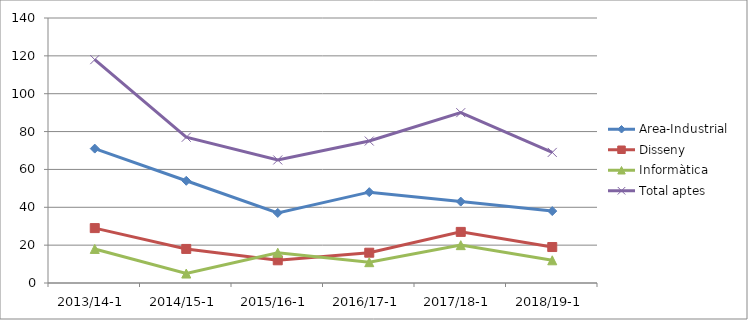
| Category | Area-Industrial | Disseny | Informàtica | Total aptes |
|---|---|---|---|---|
| 2013/14-1 | 71 | 29 | 18 | 118 |
| 2014/15-1 | 54 | 18 | 5 | 77 |
| 2015/16-1 | 37 | 12 | 16 | 65 |
| 2016/17-1 | 48 | 16 | 11 | 75 |
| 2017/18-1 | 43 | 27 | 20 | 90 |
| 2018/19-1 | 38 | 19 | 12 | 69 |